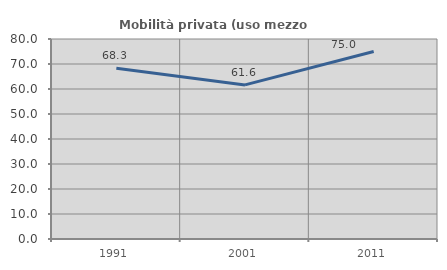
| Category | Mobilità privata (uso mezzo privato) |
|---|---|
| 1991.0 | 68.31 |
| 2001.0 | 61.644 |
| 2011.0 | 75 |